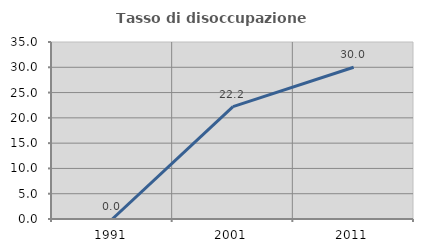
| Category | Tasso di disoccupazione giovanile  |
|---|---|
| 1991.0 | 0 |
| 2001.0 | 22.222 |
| 2011.0 | 30 |